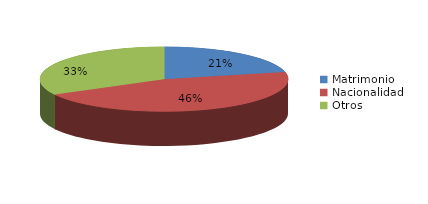
| Category | Series 0 |
|---|---|
| Matrimonio | 778 |
| Nacionalidad | 1659 |
| Otros | 1195 |